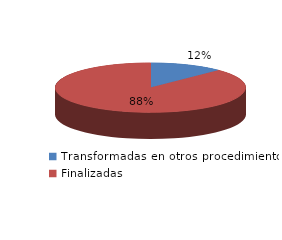
| Category | Series 0 |
|---|---|
| Transformadas en otros procedimientos | 3130 |
| Finalizadas | 21924 |